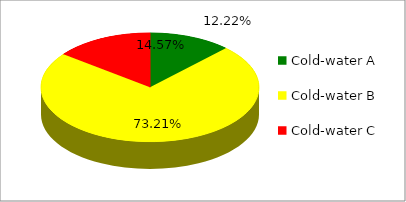
| Category | Series 0 |
|---|---|
| Cold-water A | 0.122 |
| Cold-water B | 0.732 |
| Cold-water C | 0.146 |